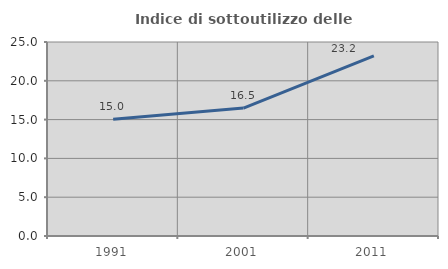
| Category | Indice di sottoutilizzo delle abitazioni  |
|---|---|
| 1991.0 | 15.045 |
| 2001.0 | 16.492 |
| 2011.0 | 23.203 |